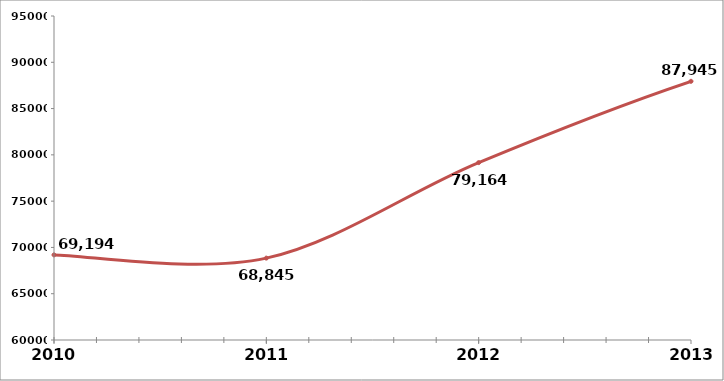
| Category | Series 0 |
|---|---|
| 2010.0 | 69194 |
| 2011.0 | 68845 |
| 2012.0 | 79164 |
| 2013.0 | 87945 |
| 2014.0 | 94540 |